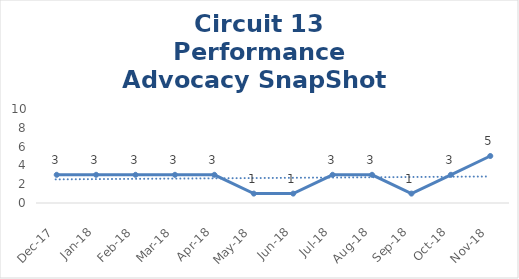
| Category | Circuit 13 |
|---|---|
| Dec-17 | 3 |
| Jan-18 | 3 |
| Feb-18 | 3 |
| Mar-18 | 3 |
| Apr-18 | 3 |
| May-18 | 1 |
| Jun-18 | 1 |
| Jul-18 | 3 |
| Aug-18 | 3 |
| Sep-18 | 1 |
| Oct-18 | 3 |
| Nov-18 | 5 |